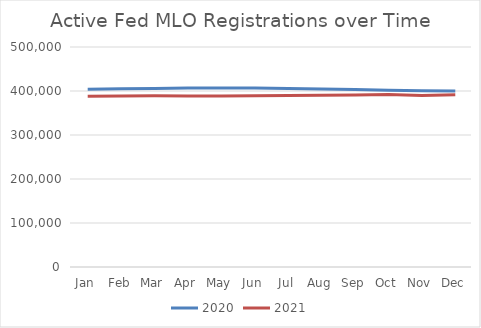
| Category | 2020 | 2021 |
|---|---|---|
| Jan | 403710 | 387828 |
| Feb | 405186 | 388400 |
| Mar | 405759 | 388942 |
| Apr | 406655 | 388810 |
| May | 406745 | 388832 |
| Jun | 407005 | 389388 |
| Jul | 405962 | 389972 |
| Aug | 404393 | 390208 |
| Sep | 403181 | 390657 |
| Oct | 401824 | 392283 |
| Nov | 400422 | 389899 |
| Dec | 400008 | 391232 |